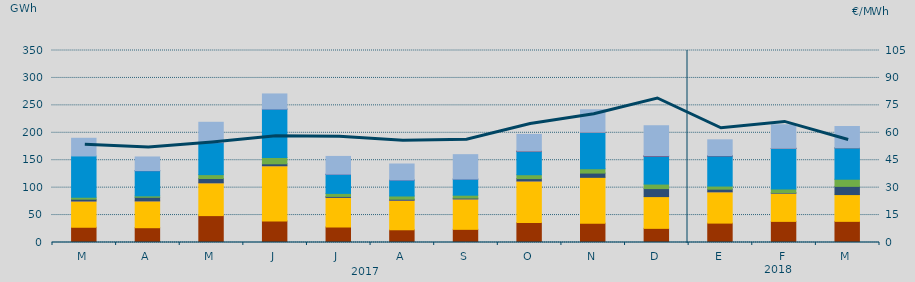
| Category | Carbón | Ciclo Combinado | Cogeneración | Consumo Bombeo | Eólica | Fuel-Gas | Hidráulica | Nuclear | Otras Renovables | Turbinación bombeo |
|---|---|---|---|---|---|---|---|---|---|---|
| M | 27782.8 | 47861.9 | 30.1 | 3279.6 | 3494.1 | 0 | 75296.7 | 0 | 0 | 32248 |
| A | 26944.8 | 48899.3 | 13.6 | 6553.1 | 2541.5 | 0 | 45882.6 | 122 | 0 | 24942.1 |
| M | 49018.7 | 59814.3 | 7.3 | 7845.9 | 7018.8 | 0 | 58284.6 | 169.5 | 0 | 36979 |
| J | 39223.4 | 100710.5 | 17.3 | 3498.8 | 11518.7 | 0 | 88256.3 | 69.8 | 0 | 27501.3 |
| J | 28227.7 | 53992.1 | 2.7 | 1736.9 | 5554.8 | 0 | 34688.7 | 310 | 0 | 32397.1 |
| A | 23185.3 | 53888.3 | 1.1 | 1823.4 | 5883.3 | 0 | 29023.6 | 148 | 0 | 29140 |
| S | 23990.4 | 55429.2 | 0.8 | 1551.4 | 5247.3 | 0 | 29358.5 | 3.1 | 0 | 44532.5 |
| O | 36235.6 | 75955.4 | 2 | 4285.9 | 7050.1 | 0 | 42190.9 | 700 | 131.3 | 30549.8 |
| N | 35124.9 | 83653.4 | 0 | 7774.4 | 7943.5 | 0 | 66112.3 | 0 | 299.1 | 41077.1 |
| D | 25784.6 | 57877.3 | 0 | 14602.9 | 8236.4 | 0 | 50297.7 | 1085.4 | 57.5 | 54906.6 |
| E | 35353.2 | 57056.1 | 10.8 | 4781.6 | 5669.6 | 0 | 55012.6 | 282.3 | 69.8 | 28937.8 |
| F | 38501.6 | 51366.4 | 3 | 876.5 | 6719.4 | 0 | 74091.8 | 129.7 | 8.1 | 42931.7 |
| M | 38546.8 | 48796.7 | 0 | 14986.9 | 13034.1 | 0 | 57129.4 | 0 | 7.9 | 39005.1 |